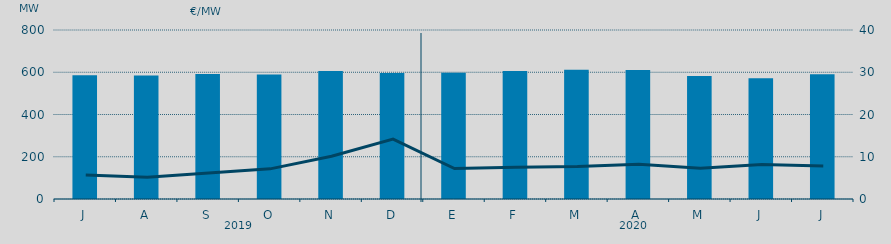
| Category | Energia (MWh) a subir |
|---|---|
| J | 585.727 |
| A | 584.609 |
| S | 591.64 |
| O | 589.349 |
| N | 605.422 |
| D | 596.999 |
| E | 597.488 |
| F | 605.632 |
| M | 611.351 |
| A | 610.483 |
| M | 582.745 |
| J | 571.897 |
| J | 590.058 |